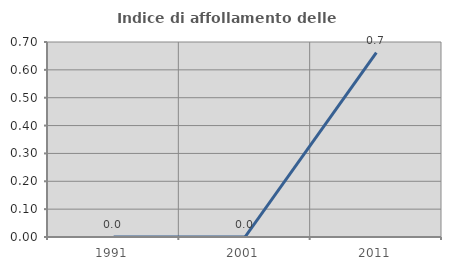
| Category | Indice di affollamento delle abitazioni  |
|---|---|
| 1991.0 | 0 |
| 2001.0 | 0 |
| 2011.0 | 0.662 |